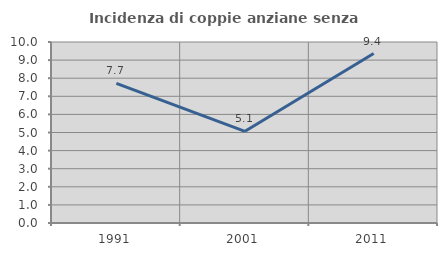
| Category | Incidenza di coppie anziane senza figli  |
|---|---|
| 1991.0 | 7.719 |
| 2001.0 | 5.065 |
| 2011.0 | 9.36 |